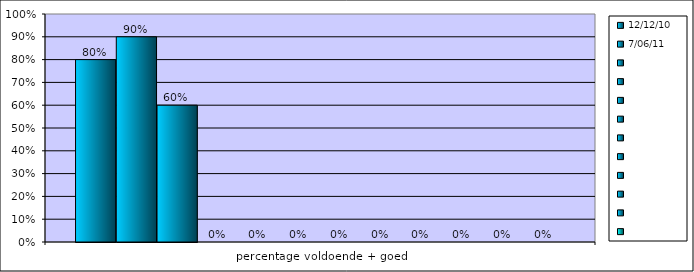
| Category | 12-12-10 | 7-06-11 | Series 2 | Series 3 | Series 4 | Series 5 | Series 6 | Series 7 | Series 8 | Series 9 | Series 10 | Series 11 |
|---|---|---|---|---|---|---|---|---|---|---|---|---|
| percentage voldoende + goed | 0.8 | 0.9 | 0.6 | 0 | 0 | 0 | 0 | 0 | 0 | 0 | 0 | 0 |